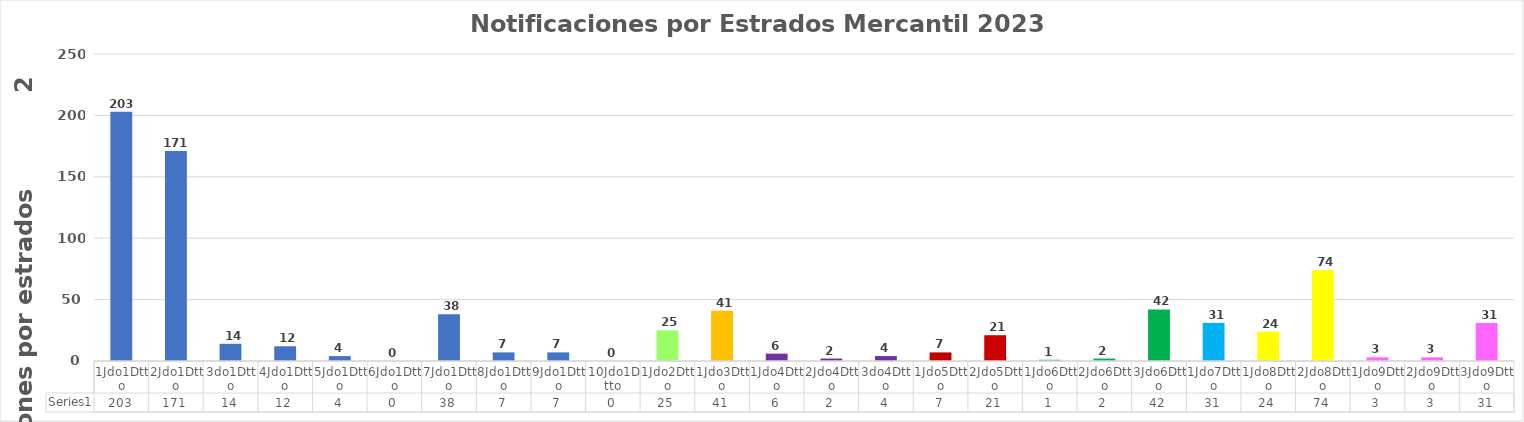
| Category | Series 0 |
|---|---|
| 1Jdo1Dtto | 203 |
| 2Jdo1Dtto | 171 |
| 3do1Dtto | 14 |
| 4Jdo1Dtto | 12 |
| 5Jdo1Dtto | 4 |
| 6Jdo1Dtto | 0 |
| 7Jdo1Dtto | 38 |
| 8Jdo1Dtto | 7 |
| 9Jdo1Dtto | 7 |
| 10Jdo1Dtto | 0 |
| 1Jdo2Dtto | 25 |
| 1Jdo3Dtto | 41 |
| 1Jdo4Dtto | 6 |
| 2Jdo4Dtto | 2 |
| 3do4Dtto | 4 |
| 1Jdo5Dtto | 7 |
| 2Jdo5Dtto | 21 |
| 1Jdo6Dtto | 1 |
| 2Jdo6Dtto | 2 |
| 3Jdo6Dtto | 42 |
| 1Jdo7Dtto | 31 |
| 1Jdo8Dtto | 24 |
| 2Jdo8Dtto | 74 |
| 1Jdo9Dtto | 3 |
| 2Jdo9Dtto | 3 |
| 3Jdo9Dtto | 31 |